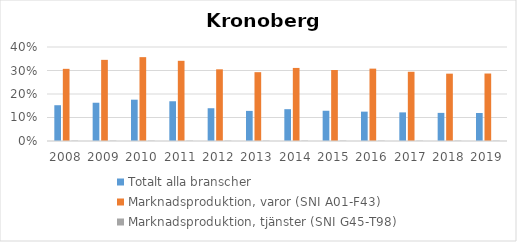
| Category | Totalt alla branscher | Marknadsproduktion, varor (SNI A01-F43) | Marknadsproduktion, tjänster (SNI G45-T98) |
|---|---|---|---|
| 2008 | 0.152 | 0.307 | 0.001 |
| 2009 | 0.163 | 0.345 | 0.001 |
| 2010 | 0.176 | 0.357 | 0.001 |
| 2011 | 0.169 | 0.341 | 0.001 |
| 2012 | 0.139 | 0.305 | 0.001 |
| 2013 | 0.128 | 0.293 | 0.001 |
| 2014 | 0.135 | 0.311 | 0.001 |
| 2015 | 0.129 | 0.302 | 0.001 |
| 2016 | 0.125 | 0.308 | 0.001 |
| 2017 | 0.122 | 0.295 | 0.001 |
| 2018 | 0.12 | 0.287 | 0.001 |
| 2019 | 0.119 | 0.287 | 0.001 |